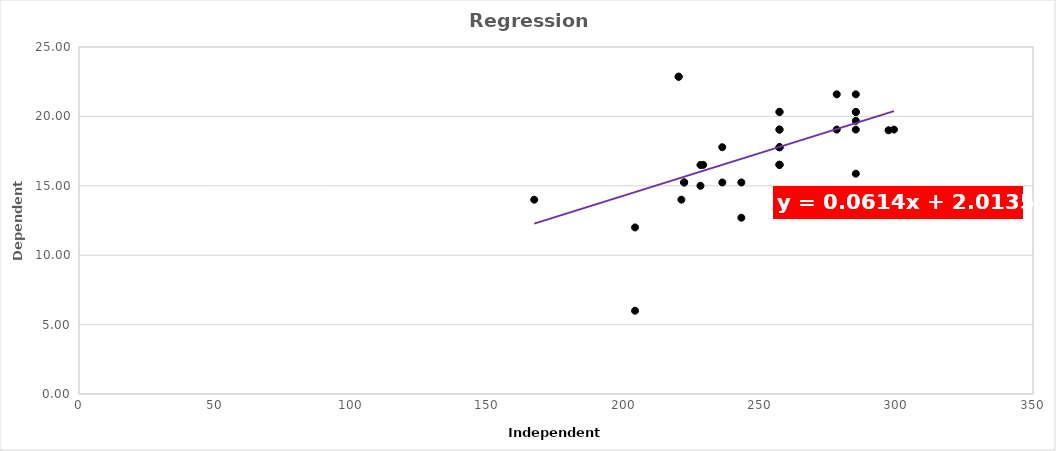
| Category | Series 0 |
|---|---|
| 167.0 | 14 |
| 204.0 | 6 |
| 204.0 | 12 |
| 220.0 | 22.86 |
| 220.0 | 22.86 |
| 221.0 | 14 |
| 222.0 | 15.24 |
| 222.0 | 15.24 |
| 228.0 | 15 |
| 228.0 | 16.5 |
| 229.0 | 16.51 |
| 236.0 | 17.78 |
| 236.0 | 15.24 |
| 243.0 | 12.7 |
| 243.0 | 15.24 |
| 257.0 | 16.51 |
| 257.0 | 16.51 |
| 257.0 | 16.51 |
| 257.0 | 17.78 |
| 257.0 | 17.78 |
| 257.0 | 17.78 |
| 257.0 | 19.05 |
| 257.0 | 19.05 |
| 257.0 | 20.32 |
| 257.0 | 20.32 |
| 278.0 | 19.05 |
| 278.0 | 21.59 |
| 285.0 | 21.59 |
| 285.0 | 19.685 |
| 285.0 | 20.32 |
| 285.0 | 15.875 |
| 285.0 | 20.32 |
| 285.0 | 19.05 |
| 297.0 | 19 |
| 299.0 | 19.05 |